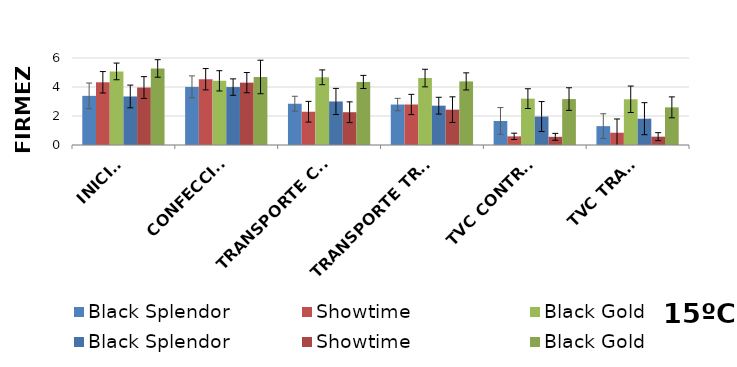
| Category | Black Splendor | Showtime | Black Gold |
|---|---|---|---|
| INICIAL | 3.348 | 3.963 | 5.278 |
| CONFECCIÓN | 3.995 | 4.3 | 4.692 |
|  TRANSPORTE CONTROL | 3.003 | 2.261 | 4.349 |
| TRANSPORTE TRAT. | 2.712 | 2.438 | 4.386 |
| TVC CONTROL | 1.962 | 0.564 | 3.168 |
| TVC TRAT. | 1.815 | 0.575 | 2.598 |